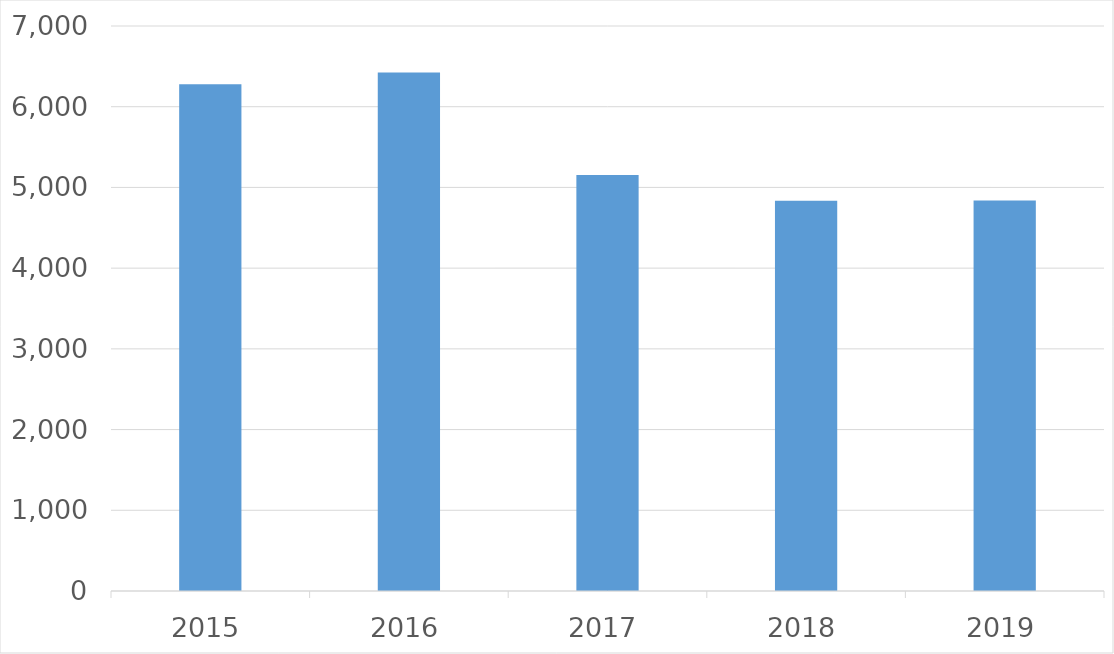
| Category | Series 0 |
|---|---|
| 2015 | 6279 |
| 2016 | 6425 |
| 2017 | 5155 |
| 2018 | 4834 |
| 2019 | 4838 |